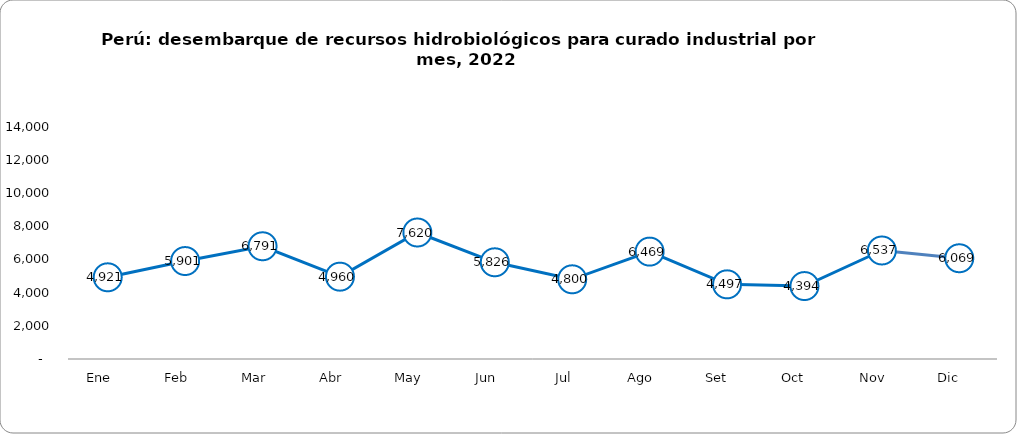
| Category | Total |
|---|---|
| Ene    | 4921.075 |
| Feb    | 5901.081 |
| Mar    | 6790.576 |
| Abr    | 4959.694 |
| May    | 7619.625 |
| Jun    | 5825.578 |
| Jul    | 4800.408 |
| Ago    | 6469.232 |
| Set     | 4497.268 |
| Oct     | 4394.019 |
| Nov    | 6536.735 |
| Dic     | 6068.956 |